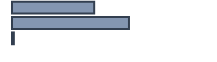
| Category | Series 0 |
|---|---|
| 0 | 40.884 |
| 1 | 58.194 |
| 2 | 0.922 |